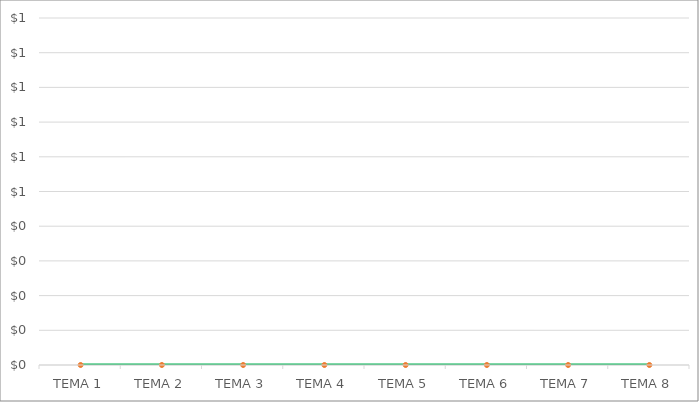
| Category | Series 1 |
|---|---|
| TEMA 1 | 0 |
| TEMA 2 | 0 |
| TEMA 3 | 0 |
| TEMA 4 | 0 |
| TEMA 5 | 0 |
| TEMA 6 | 0 |
| TEMA 7 | 0 |
| TEMA 8 | 0 |